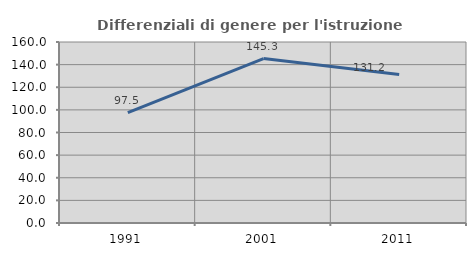
| Category | Differenziali di genere per l'istruzione superiore |
|---|---|
| 1991.0 | 97.48 |
| 2001.0 | 145.34 |
| 2011.0 | 131.178 |